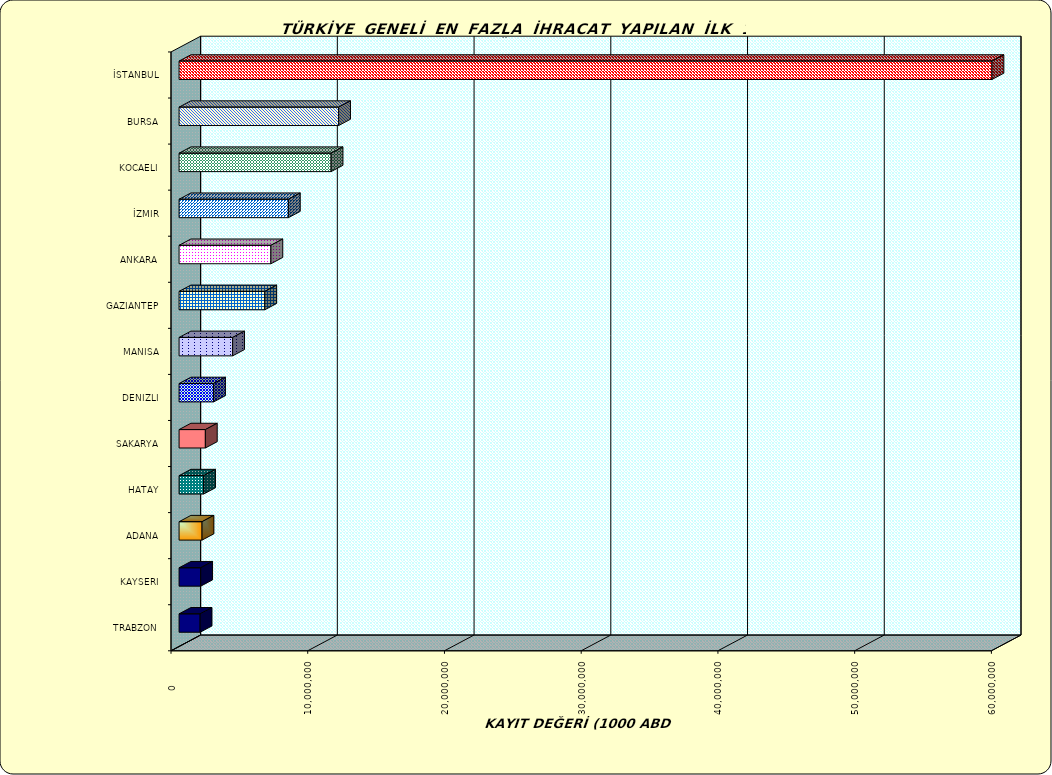
| Category | Series 0 |
|---|---|
| İSTANBUL | 59452884.444 |
| BURSA | 11668870.597 |
| KOCAELI | 11117929.19 |
| İZMIR | 7995712.538 |
| ANKARA | 6716775.635 |
| GAZIANTEP | 6270202.568 |
| MANISA | 3916306.787 |
| DENIZLI | 2523669.205 |
| SAKARYA | 1922187.301 |
| HATAY | 1793517.99 |
| ADANA | 1679454.182 |
| KAYSERI | 1581953.63 |
| TRABZON | 1538982.678 |